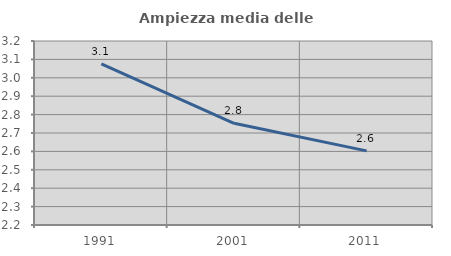
| Category | Ampiezza media delle famiglie |
|---|---|
| 1991.0 | 3.076 |
| 2001.0 | 2.753 |
| 2011.0 | 2.603 |